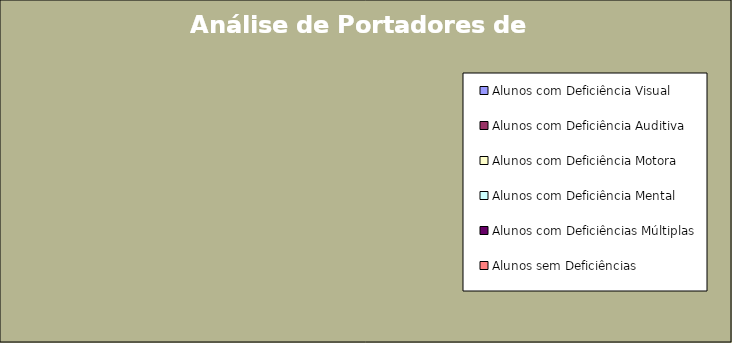
| Category | Series 0 |
|---|---|
| Alunos com Deficiência Visual | 0 |
| Alunos com Deficiência Auditiva | 0 |
| Alunos com Deficiência Motora | 0 |
| Alunos com Deficiência Mental | 0 |
| Alunos com Deficiências Múltiplas | 0 |
| Alunos sem Deficiências | 0 |